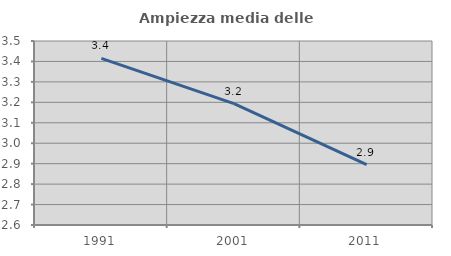
| Category | Ampiezza media delle famiglie |
|---|---|
| 1991.0 | 3.415 |
| 2001.0 | 3.193 |
| 2011.0 | 2.896 |